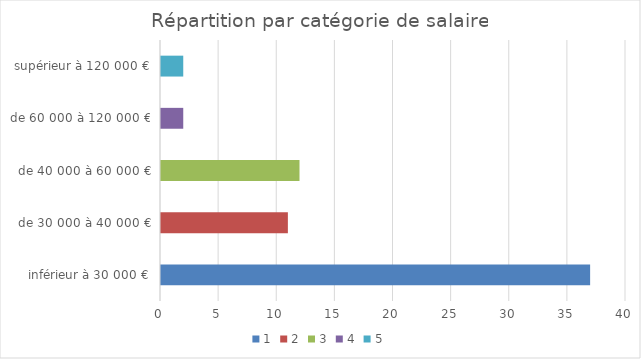
| Category | 1 | 2 | 3 | 4 | 5 |
|---|---|---|---|---|---|
| inférieur à 30 000 € | 37 | 0 | 0 | 0 | 0 |
| de 30 000 à 40 000 € | 0 | 11 | 0 | 0 | 0 |
| de 40 000 à 60 000 € | 0 | 0 | 12 | 0 | 0 |
| de 60 000 à 120 000 € | 0 | 0 | 0 | 2 | 0 |
| supérieur à 120 000 € | 0 | 0 | 0 | 0 | 2 |